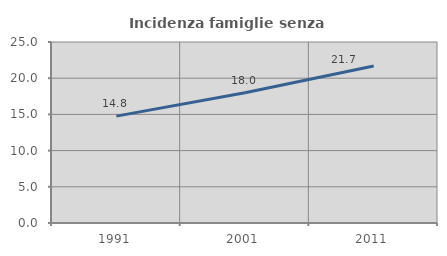
| Category | Incidenza famiglie senza nuclei |
|---|---|
| 1991.0 | 14.761 |
| 2001.0 | 17.996 |
| 2011.0 | 21.68 |